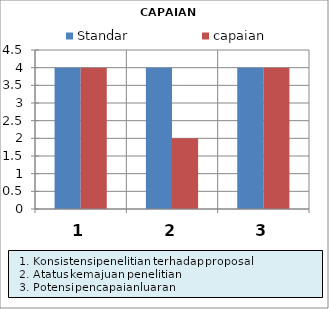
| Category | Standar | capaian |
|---|---|---|
| 0 | 4 | 4 |
| 1 | 4 | 2 |
| 2 | 4 | 4 |